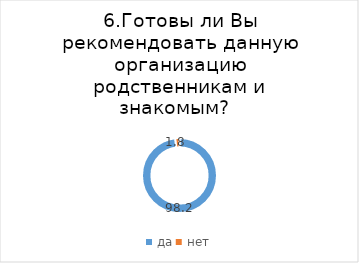
| Category | Series 0 |
|---|---|
| да | 98.208 |
| нет | 1.792 |